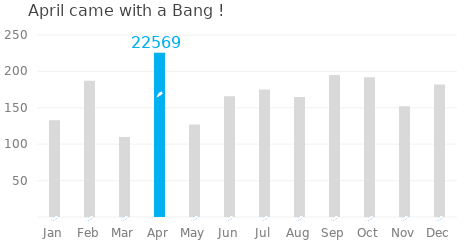
| Category | Series 1 |
|---|---|
| Jan | 133 |
| Feb | 187 |
| Mar | 110 |
| Apr | 0 |
| May | 127 |
| Jun | 166 |
| Jul | 175 |
| Aug | 165 |
| Sep | 195 |
| Oct | 192 |
| Nov | 152 |
| Dec | 182 |